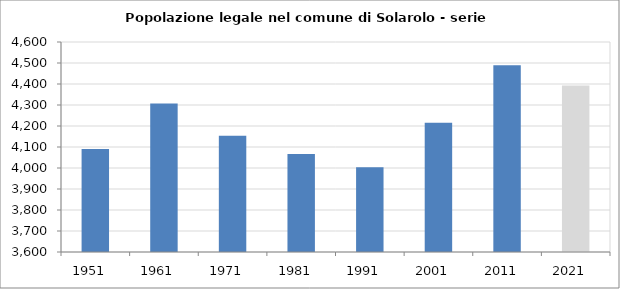
| Category | Popolazione residente |
|---|---|
| 1951   | 4091 |
| 1961   | 4307 |
| 1971   | 4153 |
| 1981   | 4067 |
| 1991   | 4004 |
| 2001   | 4216 |
| 2011   | 4489 |
| 2021   | 4393 |